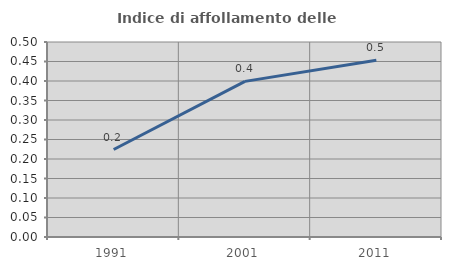
| Category | Indice di affollamento delle abitazioni  |
|---|---|
| 1991.0 | 0.224 |
| 2001.0 | 0.399 |
| 2011.0 | 0.453 |